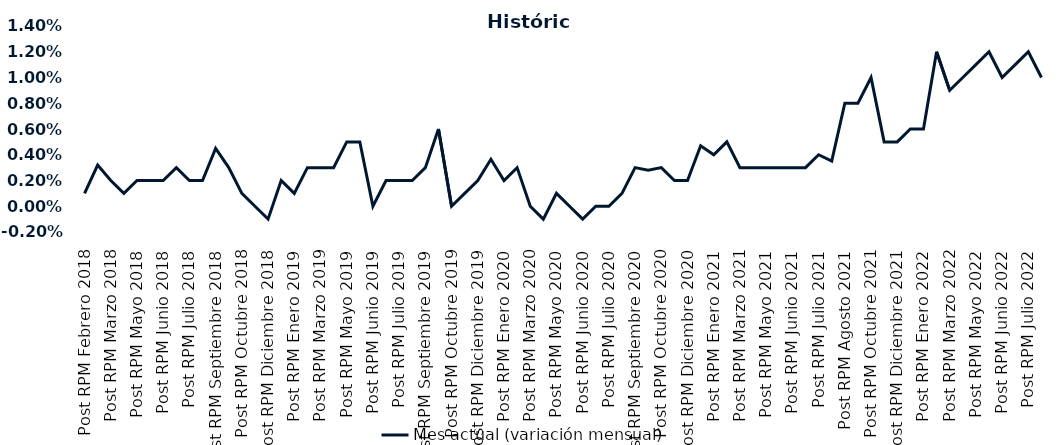
| Category | Mes actual (variación mensual)  |
|---|---|
| Post RPM Febrero 2018 | 0.001 |
| Pre RPM Marzo 2018 | 0.003 |
| Post RPM Marzo 2018 | 0.002 |
| Pre RPM Mayo 2018 | 0.001 |
| Post RPM Mayo 2018 | 0.002 |
| Pre RPM Junio 2018 | 0.002 |
| Post RPM Junio 2018 | 0.002 |
| Pre RPM Julio 2018 | 0.003 |
| Post RPM Julio 2018 | 0.002 |
| Pre RPM Septiembre 2018 | 0.002 |
| Post RPM Septiembre 2018 | 0.004 |
| Pre RPM Octubre 2018 | 0.003 |
| Post RPM Octubre 2018 | 0.001 |
| Pre RPM Diciembre 2018 | 0 |
| Post RPM Diciembre 2018 | -0.001 |
| Pre RPM Enero 2019 | 0.002 |
| Post RPM Enero 2019 | 0.001 |
| Pre RPM Marzo 2019 | 0.003 |
| Post RPM Marzo 2019 | 0.003 |
| Pre RPM Mayo 2019 | 0.003 |
| Post RPM Mayo 2019 | 0.005 |
| Pre RPM Junio 2019 | 0.005 |
| Post RPM Junio 2019 | 0 |
| Pre RPM Julio 2019 | 0.002 |
| Post RPM Julio 2019 | 0.002 |
| Pre RPM Septiembre 2019 | 0.002 |
| Post RPM Septiembre 2019 | 0.003 |
| Pre RPM Octubre 2019 | 0.006 |
| Post RPM Octubre 2019 | 0 |
| Pre RPM Diciembre 2019 | 0.001 |
| Post RPM Diciembre 2019 | 0.002 |
| Pre RPM Enero 2020 | 0.004 |
| Post RPM Enero 2020 | 0.002 |
| Pre RPM Marzo 2020 | 0.003 |
| Post RPM Marzo 2020 | 0 |
| Pre RPM Mayo 2020 | -0.001 |
| Post RPM Mayo 2020 | 0.001 |
| Pre RPM Junio 2020 | 0 |
| Post RPM Junio 2020 | -0.001 |
| Pre RPM Julio 2020 | 0 |
| Post RPM Julio 2020 | 0 |
| Pre RPM Septiembre 2020 | 0.001 |
| Post RPM Septiembre 2020 | 0.003 |
| Pre RPM Octubre 2020 | 0.003 |
| Post RPM Octubre 2020 | 0.003 |
| Pre RPM Diciembre 2020 | 0.002 |
| Post RPM Diciembre 2020 | 0.002 |
| Pre RPM Enero 2021 | 0.005 |
| Post RPM Enero 2021 | 0.004 |
| Pre RPM Marzo 2021 | 0.005 |
| Post RPM Marzo 2021 | 0.003 |
| Pre RPM Mayo 2021 | 0.003 |
| Post RPM Mayo 2021 | 0.003 |
| Pre RPM Junio 2021 | 0.003 |
| Post RPM Junio 2021 | 0.003 |
| Pre RPM Julio 2021 | 0.003 |
| Post RPM Julio 2021 | 0.004 |
| Pre RPM Agosto 2021 | 0.004 |
| Post RPM Agosto 2021 | 0.008 |
| Pre RPM Octubre 2021 | 0.008 |
| Post RPM Octubre 2021 | 0.01 |
| Pre RPM Diciembre 2021 | 0.005 |
| Post RPM Diciembre 2021 | 0.005 |
| Pre RPM Enero 2022 | 0.006 |
| Post RPM Enero 2022 | 0.006 |
| Pre RPM Marzo 2022 | 0.012 |
| Post RPM Marzo 2022 | 0.009 |
| Pre RPM Mayo 2022 | 0.01 |
| Post RPM Mayo 2022 | 0.011 |
| Pre RPM Junio 2022 | 0.012 |
| Post RPM Junio 2022 | 0.01 |
| Pre RPM Julio 2022 | 0.011 |
| Post RPM Julio 2022 | 0.012 |
| Pre RPM Septiembre 2022 | 0.01 |